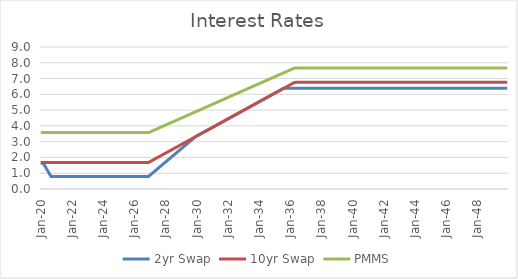
| Category | 2yr Swap | 10yr Swap | PMMS |
|---|---|---|---|
| 2020-01-31 | 1.63 | 1.681 | 3.575 |
| 2020-02-29 | 1.63 | 1.681 | 3.575 |
| 2020-03-31 | 1.63 | 1.681 | 3.575 |
| 2020-04-30 | 1.49 | 1.681 | 3.575 |
| 2020-05-31 | 1.351 | 1.681 | 3.574 |
| 2020-06-30 | 1.212 | 1.681 | 3.574 |
| 2020-07-31 | 1.072 | 1.681 | 3.574 |
| 2020-08-31 | 0.933 | 1.681 | 3.574 |
| 2020-09-30 | 0.798 | 1.681 | 3.574 |
| 2020-10-31 | 0.798 | 1.681 | 3.574 |
| 2020-11-30 | 0.798 | 1.681 | 3.574 |
| 2020-12-31 | 0.798 | 1.681 | 3.574 |
| 2021-01-31 | 0.798 | 1.681 | 3.574 |
| 2021-02-28 | 0.798 | 1.681 | 3.574 |
| 2021-03-31 | 0.798 | 1.681 | 3.574 |
| 2021-04-30 | 0.798 | 1.681 | 3.574 |
| 2021-05-31 | 0.798 | 1.681 | 3.574 |
| 2021-06-30 | 0.798 | 1.681 | 3.574 |
| 2021-07-31 | 0.798 | 1.681 | 3.574 |
| 2021-08-31 | 0.798 | 1.681 | 3.574 |
| 2021-09-30 | 0.798 | 1.681 | 3.574 |
| 2021-10-31 | 0.798 | 1.681 | 3.574 |
| 2021-11-30 | 0.798 | 1.681 | 3.574 |
| 2021-12-31 | 0.798 | 1.681 | 3.574 |
| 2022-01-31 | 0.798 | 1.681 | 3.574 |
| 2022-02-28 | 0.798 | 1.681 | 3.574 |
| 2022-03-31 | 0.798 | 1.681 | 3.574 |
| 2022-04-30 | 0.798 | 1.681 | 3.574 |
| 2022-05-31 | 0.798 | 1.681 | 3.574 |
| 2022-06-30 | 0.798 | 1.681 | 3.574 |
| 2022-07-31 | 0.798 | 1.681 | 3.574 |
| 2022-08-31 | 0.798 | 1.681 | 3.574 |
| 2022-09-30 | 0.798 | 1.681 | 3.574 |
| 2022-10-31 | 0.798 | 1.681 | 3.574 |
| 2022-11-30 | 0.798 | 1.681 | 3.574 |
| 2022-12-31 | 0.798 | 1.681 | 3.574 |
| 2023-01-31 | 0.798 | 1.681 | 3.574 |
| 2023-02-28 | 0.798 | 1.681 | 3.574 |
| 2023-03-31 | 0.798 | 1.681 | 3.574 |
| 2023-04-30 | 0.798 | 1.681 | 3.574 |
| 2023-05-31 | 0.798 | 1.681 | 3.574 |
| 2023-06-30 | 0.798 | 1.681 | 3.574 |
| 2023-07-31 | 0.798 | 1.681 | 3.574 |
| 2023-08-31 | 0.798 | 1.681 | 3.574 |
| 2023-09-30 | 0.798 | 1.681 | 3.574 |
| 2023-10-31 | 0.798 | 1.681 | 3.574 |
| 2023-11-30 | 0.798 | 1.681 | 3.574 |
| 2023-12-31 | 0.798 | 1.681 | 3.574 |
| 2024-01-31 | 0.798 | 1.681 | 3.574 |
| 2024-02-29 | 0.798 | 1.681 | 3.574 |
| 2024-03-31 | 0.798 | 1.681 | 3.574 |
| 2024-04-30 | 0.798 | 1.681 | 3.574 |
| 2024-05-31 | 0.798 | 1.681 | 3.574 |
| 2024-06-30 | 0.798 | 1.681 | 3.574 |
| 2024-07-31 | 0.798 | 1.681 | 3.574 |
| 2024-08-31 | 0.798 | 1.681 | 3.574 |
| 2024-09-30 | 0.798 | 1.681 | 3.574 |
| 2024-10-31 | 0.798 | 1.681 | 3.574 |
| 2024-11-30 | 0.798 | 1.681 | 3.574 |
| 2024-12-31 | 0.798 | 1.681 | 3.574 |
| 2025-01-31 | 0.798 | 1.681 | 3.574 |
| 2025-02-28 | 0.798 | 1.681 | 3.574 |
| 2025-03-31 | 0.798 | 1.681 | 3.574 |
| 2025-04-30 | 0.798 | 1.681 | 3.574 |
| 2025-05-31 | 0.798 | 1.681 | 3.574 |
| 2025-06-30 | 0.798 | 1.681 | 3.574 |
| 2025-07-31 | 0.798 | 1.681 | 3.574 |
| 2025-08-31 | 0.798 | 1.681 | 3.574 |
| 2025-09-30 | 0.798 | 1.681 | 3.574 |
| 2025-10-31 | 0.798 | 1.681 | 3.574 |
| 2025-11-30 | 0.798 | 1.681 | 3.574 |
| 2025-12-31 | 0.798 | 1.681 | 3.574 |
| 2026-01-31 | 0.798 | 1.681 | 3.574 |
| 2026-02-28 | 0.798 | 1.681 | 3.574 |
| 2026-03-31 | 0.798 | 1.681 | 3.574 |
| 2026-04-30 | 0.798 | 1.681 | 3.574 |
| 2026-05-31 | 0.798 | 1.681 | 3.574 |
| 2026-06-30 | 0.798 | 1.681 | 3.574 |
| 2026-07-31 | 0.798 | 1.681 | 3.574 |
| 2026-08-31 | 0.798 | 1.681 | 3.574 |
| 2026-09-30 | 0.798 | 1.681 | 3.574 |
| 2026-10-31 | 0.798 | 1.681 | 3.574 |
| 2026-11-30 | 0.798 | 1.681 | 3.574 |
| 2026-12-31 | 0.798 | 1.681 | 3.574 |
| 2027-01-31 | 0.868 | 1.726 | 3.611 |
| 2027-02-28 | 0.938 | 1.772 | 3.647 |
| 2027-03-31 | 1.007 | 1.817 | 3.683 |
| 2027-04-30 | 1.077 | 1.862 | 3.72 |
| 2027-05-31 | 1.147 | 1.907 | 3.756 |
| 2027-06-30 | 1.216 | 1.953 | 3.793 |
| 2027-07-31 | 1.286 | 1.998 | 3.829 |
| 2027-08-31 | 1.356 | 2.043 | 3.866 |
| 2027-09-30 | 1.425 | 2.088 | 3.902 |
| 2027-10-31 | 1.495 | 2.133 | 3.939 |
| 2027-11-30 | 1.565 | 2.179 | 3.975 |
| 2027-12-31 | 1.634 | 2.224 | 4.012 |
| 2028-01-31 | 1.704 | 2.269 | 4.048 |
| 2028-02-29 | 1.774 | 2.314 | 4.085 |
| 2028-03-31 | 1.843 | 2.36 | 4.121 |
| 2028-04-30 | 1.913 | 2.405 | 4.158 |
| 2028-05-31 | 1.983 | 2.45 | 4.194 |
| 2028-06-30 | 2.052 | 2.495 | 4.231 |
| 2028-07-31 | 2.122 | 2.54 | 4.267 |
| 2028-08-31 | 2.192 | 2.586 | 4.304 |
| 2028-09-30 | 2.261 | 2.631 | 4.34 |
| 2028-10-31 | 2.331 | 2.676 | 4.377 |
| 2028-11-30 | 2.401 | 2.721 | 4.413 |
| 2028-12-31 | 2.47 | 2.767 | 4.45 |
| 2029-01-31 | 2.54 | 2.812 | 4.486 |
| 2029-02-28 | 2.61 | 2.857 | 4.523 |
| 2029-03-31 | 2.679 | 2.902 | 4.559 |
| 2029-04-30 | 2.749 | 2.947 | 4.595 |
| 2029-05-31 | 2.819 | 2.993 | 4.632 |
| 2029-06-30 | 2.888 | 3.038 | 4.668 |
| 2029-07-31 | 2.958 | 3.083 | 4.705 |
| 2029-08-31 | 3.028 | 3.128 | 4.741 |
| 2029-09-30 | 3.097 | 3.173 | 4.778 |
| 2029-10-31 | 3.167 | 3.219 | 4.814 |
| 2029-11-30 | 3.237 | 3.264 | 4.851 |
| 2029-12-31 | 3.306 | 3.309 | 4.887 |
| 2030-01-31 | 3.354 | 3.354 | 4.924 |
| 2030-02-28 | 3.4 | 3.4 | 4.96 |
| 2030-03-31 | 3.445 | 3.445 | 4.997 |
| 2030-04-30 | 3.49 | 3.49 | 5.033 |
| 2030-05-31 | 3.535 | 3.535 | 5.07 |
| 2030-06-30 | 3.58 | 3.58 | 5.106 |
| 2030-07-31 | 3.626 | 3.626 | 5.143 |
| 2030-08-31 | 3.671 | 3.671 | 5.179 |
| 2030-09-30 | 3.716 | 3.716 | 5.215 |
| 2030-10-31 | 3.761 | 3.761 | 5.252 |
| 2030-11-30 | 3.807 | 3.807 | 5.288 |
| 2030-12-31 | 3.852 | 3.852 | 5.325 |
| 2031-01-31 | 3.897 | 3.897 | 5.361 |
| 2031-02-28 | 3.942 | 3.942 | 5.398 |
| 2031-03-31 | 3.987 | 3.987 | 5.434 |
| 2031-04-30 | 4.033 | 4.033 | 5.471 |
| 2031-05-31 | 4.078 | 4.078 | 5.507 |
| 2031-06-30 | 4.123 | 4.123 | 5.544 |
| 2031-07-31 | 4.168 | 4.168 | 5.58 |
| 2031-08-31 | 4.214 | 4.214 | 5.617 |
| 2031-09-30 | 4.259 | 4.259 | 5.653 |
| 2031-10-31 | 4.304 | 4.304 | 5.689 |
| 2031-11-30 | 4.349 | 4.349 | 5.726 |
| 2031-12-31 | 4.394 | 4.394 | 5.762 |
| 2032-01-31 | 4.44 | 4.44 | 5.799 |
| 2032-02-29 | 4.485 | 4.485 | 5.835 |
| 2032-03-31 | 4.53 | 4.53 | 5.872 |
| 2032-04-30 | 4.575 | 4.575 | 5.908 |
| 2032-05-31 | 4.621 | 4.621 | 5.945 |
| 2032-06-30 | 4.666 | 4.666 | 5.981 |
| 2032-07-31 | 4.711 | 4.711 | 6.018 |
| 2032-08-31 | 4.756 | 4.756 | 6.054 |
| 2032-09-30 | 4.801 | 4.801 | 6.091 |
| 2032-10-31 | 4.847 | 4.847 | 6.127 |
| 2032-11-30 | 4.892 | 4.892 | 6.163 |
| 2032-12-31 | 4.937 | 4.937 | 6.2 |
| 2033-01-31 | 4.982 | 4.982 | 6.236 |
| 2033-02-28 | 5.028 | 5.028 | 6.273 |
| 2033-03-31 | 5.073 | 5.073 | 6.309 |
| 2033-04-30 | 5.118 | 5.118 | 6.346 |
| 2033-05-31 | 5.163 | 5.163 | 6.382 |
| 2033-06-30 | 5.208 | 5.208 | 6.419 |
| 2033-07-31 | 5.254 | 5.254 | 6.455 |
| 2033-08-31 | 5.299 | 5.299 | 6.492 |
| 2033-09-30 | 5.344 | 5.344 | 6.528 |
| 2033-10-31 | 5.389 | 5.389 | 6.565 |
| 2033-11-30 | 5.435 | 5.435 | 6.601 |
| 2033-12-31 | 5.48 | 5.48 | 6.637 |
| 2034-01-31 | 5.525 | 5.525 | 6.674 |
| 2034-02-28 | 5.57 | 5.57 | 6.71 |
| 2034-03-31 | 5.615 | 5.615 | 6.747 |
| 2034-04-30 | 5.661 | 5.661 | 6.783 |
| 2034-05-31 | 5.706 | 5.706 | 6.82 |
| 2034-06-30 | 5.751 | 5.751 | 6.856 |
| 2034-07-31 | 5.796 | 5.796 | 6.893 |
| 2034-08-31 | 5.842 | 5.842 | 6.929 |
| 2034-09-30 | 5.887 | 5.887 | 6.966 |
| 2034-10-31 | 5.932 | 5.932 | 7.002 |
| 2034-11-30 | 5.977 | 5.977 | 7.039 |
| 2034-12-31 | 6.022 | 6.022 | 7.075 |
| 2035-01-31 | 6.068 | 6.068 | 7.111 |
| 2035-02-28 | 6.113 | 6.113 | 7.148 |
| 2035-03-31 | 6.158 | 6.158 | 7.184 |
| 2035-04-30 | 6.203 | 6.203 | 7.221 |
| 2035-05-31 | 6.248 | 6.248 | 7.257 |
| 2035-06-30 | 6.294 | 6.294 | 7.294 |
| 2035-07-31 | 6.339 | 6.339 | 7.33 |
| 2035-08-31 | 6.384 | 6.384 | 7.367 |
| 2035-09-30 | 6.387 | 6.429 | 7.403 |
| 2035-10-31 | 6.387 | 6.475 | 7.44 |
| 2035-11-30 | 6.387 | 6.52 | 7.476 |
| 2035-12-31 | 6.387 | 6.565 | 7.512 |
| 2036-01-31 | 6.387 | 6.61 | 7.549 |
| 2036-02-29 | 6.387 | 6.655 | 7.585 |
| 2036-03-31 | 6.387 | 6.701 | 7.622 |
| 2036-04-30 | 6.387 | 6.746 | 7.658 |
| 2036-05-31 | 6.387 | 6.758 | 7.668 |
| 2036-06-30 | 6.387 | 6.758 | 7.668 |
| 2036-07-31 | 6.387 | 6.758 | 7.668 |
| 2036-08-31 | 6.387 | 6.758 | 7.668 |
| 2036-09-30 | 6.387 | 6.758 | 7.668 |
| 2036-10-31 | 6.387 | 6.758 | 7.668 |
| 2036-11-30 | 6.387 | 6.758 | 7.668 |
| 2036-12-31 | 6.387 | 6.758 | 7.668 |
| 2037-01-31 | 6.387 | 6.758 | 7.668 |
| 2037-02-28 | 6.387 | 6.758 | 7.668 |
| 2037-03-31 | 6.387 | 6.758 | 7.668 |
| 2037-04-30 | 6.387 | 6.758 | 7.668 |
| 2037-05-31 | 6.387 | 6.758 | 7.668 |
| 2037-06-30 | 6.387 | 6.758 | 7.668 |
| 2037-07-31 | 6.387 | 6.758 | 7.668 |
| 2037-08-31 | 6.387 | 6.758 | 7.668 |
| 2037-09-30 | 6.387 | 6.758 | 7.668 |
| 2037-10-31 | 6.387 | 6.758 | 7.668 |
| 2037-11-30 | 6.387 | 6.758 | 7.668 |
| 2037-12-31 | 6.387 | 6.758 | 7.668 |
| 2038-01-31 | 6.387 | 6.758 | 7.668 |
| 2038-02-28 | 6.387 | 6.758 | 7.668 |
| 2038-03-31 | 6.387 | 6.758 | 7.668 |
| 2038-04-30 | 6.387 | 6.758 | 7.668 |
| 2038-05-31 | 6.387 | 6.758 | 7.668 |
| 2038-06-30 | 6.387 | 6.758 | 7.668 |
| 2038-07-31 | 6.387 | 6.758 | 7.668 |
| 2038-08-31 | 6.387 | 6.758 | 7.668 |
| 2038-09-30 | 6.387 | 6.758 | 7.668 |
| 2038-10-31 | 6.387 | 6.758 | 7.668 |
| 2038-11-30 | 6.387 | 6.758 | 7.668 |
| 2038-12-31 | 6.387 | 6.758 | 7.668 |
| 2039-01-31 | 6.387 | 6.758 | 7.668 |
| 2039-02-28 | 6.387 | 6.758 | 7.668 |
| 2039-03-31 | 6.387 | 6.758 | 7.668 |
| 2039-04-30 | 6.387 | 6.758 | 7.668 |
| 2039-05-31 | 6.387 | 6.758 | 7.668 |
| 2039-06-30 | 6.387 | 6.758 | 7.668 |
| 2039-07-31 | 6.387 | 6.758 | 7.668 |
| 2039-08-31 | 6.387 | 6.758 | 7.668 |
| 2039-09-30 | 6.387 | 6.758 | 7.668 |
| 2039-10-31 | 6.387 | 6.758 | 7.668 |
| 2039-11-30 | 6.387 | 6.758 | 7.668 |
| 2039-12-31 | 6.387 | 6.758 | 7.668 |
| 2040-01-31 | 6.387 | 6.758 | 7.668 |
| 2040-02-29 | 6.387 | 6.758 | 7.668 |
| 2040-03-31 | 6.387 | 6.758 | 7.668 |
| 2040-04-30 | 6.387 | 6.758 | 7.668 |
| 2040-05-31 | 6.387 | 6.758 | 7.668 |
| 2040-06-30 | 6.387 | 6.758 | 7.668 |
| 2040-07-31 | 6.387 | 6.758 | 7.668 |
| 2040-08-31 | 6.387 | 6.758 | 7.668 |
| 2040-09-30 | 6.387 | 6.758 | 7.668 |
| 2040-10-31 | 6.387 | 6.758 | 7.668 |
| 2040-11-30 | 6.387 | 6.758 | 7.668 |
| 2040-12-31 | 6.387 | 6.758 | 7.668 |
| 2041-01-31 | 6.387 | 6.758 | 7.668 |
| 2041-02-28 | 6.387 | 6.758 | 7.668 |
| 2041-03-31 | 6.387 | 6.758 | 7.668 |
| 2041-04-30 | 6.387 | 6.758 | 7.668 |
| 2041-05-31 | 6.387 | 6.758 | 7.668 |
| 2041-06-30 | 6.387 | 6.758 | 7.668 |
| 2041-07-31 | 6.387 | 6.758 | 7.668 |
| 2041-08-31 | 6.387 | 6.758 | 7.668 |
| 2041-09-30 | 6.387 | 6.758 | 7.668 |
| 2041-10-31 | 6.387 | 6.758 | 7.668 |
| 2041-11-30 | 6.387 | 6.758 | 7.668 |
| 2041-12-31 | 6.387 | 6.758 | 7.668 |
| 2042-01-31 | 6.387 | 6.758 | 7.668 |
| 2042-02-28 | 6.387 | 6.758 | 7.668 |
| 2042-03-31 | 6.387 | 6.758 | 7.668 |
| 2042-04-30 | 6.387 | 6.758 | 7.668 |
| 2042-05-31 | 6.387 | 6.758 | 7.668 |
| 2042-06-30 | 6.387 | 6.758 | 7.668 |
| 2042-07-31 | 6.387 | 6.758 | 7.668 |
| 2042-08-31 | 6.387 | 6.758 | 7.668 |
| 2042-09-30 | 6.387 | 6.758 | 7.668 |
| 2042-10-31 | 6.387 | 6.758 | 7.668 |
| 2042-11-30 | 6.387 | 6.758 | 7.668 |
| 2042-12-31 | 6.387 | 6.758 | 7.668 |
| 2043-01-31 | 6.387 | 6.758 | 7.668 |
| 2043-02-28 | 6.387 | 6.758 | 7.668 |
| 2043-03-31 | 6.387 | 6.758 | 7.668 |
| 2043-04-30 | 6.387 | 6.758 | 7.668 |
| 2043-05-31 | 6.387 | 6.758 | 7.668 |
| 2043-06-30 | 6.387 | 6.758 | 7.668 |
| 2043-07-31 | 6.387 | 6.758 | 7.668 |
| 2043-08-31 | 6.387 | 6.758 | 7.668 |
| 2043-09-30 | 6.387 | 6.758 | 7.668 |
| 2043-10-31 | 6.387 | 6.758 | 7.668 |
| 2043-11-30 | 6.387 | 6.758 | 7.668 |
| 2043-12-31 | 6.387 | 6.758 | 7.668 |
| 2044-01-31 | 6.387 | 6.758 | 7.668 |
| 2044-02-29 | 6.387 | 6.758 | 7.668 |
| 2044-03-31 | 6.387 | 6.758 | 7.668 |
| 2044-04-30 | 6.387 | 6.758 | 7.668 |
| 2044-05-31 | 6.387 | 6.758 | 7.668 |
| 2044-06-30 | 6.387 | 6.758 | 7.668 |
| 2044-07-31 | 6.387 | 6.758 | 7.668 |
| 2044-08-31 | 6.387 | 6.758 | 7.668 |
| 2044-09-30 | 6.387 | 6.758 | 7.668 |
| 2044-10-31 | 6.387 | 6.758 | 7.668 |
| 2044-11-30 | 6.387 | 6.758 | 7.668 |
| 2044-12-31 | 6.387 | 6.758 | 7.668 |
| 2045-01-31 | 6.387 | 6.758 | 7.668 |
| 2045-02-28 | 6.387 | 6.758 | 7.668 |
| 2045-03-31 | 6.387 | 6.758 | 7.668 |
| 2045-04-30 | 6.387 | 6.758 | 7.668 |
| 2045-05-31 | 6.387 | 6.758 | 7.668 |
| 2045-06-30 | 6.387 | 6.758 | 7.668 |
| 2045-07-31 | 6.387 | 6.758 | 7.668 |
| 2045-08-31 | 6.387 | 6.758 | 7.668 |
| 2045-09-30 | 6.387 | 6.758 | 7.668 |
| 2045-10-31 | 6.387 | 6.758 | 7.668 |
| 2045-11-30 | 6.387 | 6.758 | 7.668 |
| 2045-12-31 | 6.387 | 6.758 | 7.668 |
| 2046-01-31 | 6.387 | 6.758 | 7.668 |
| 2046-02-28 | 6.387 | 6.758 | 7.668 |
| 2046-03-31 | 6.387 | 6.758 | 7.668 |
| 2046-04-30 | 6.387 | 6.758 | 7.668 |
| 2046-05-31 | 6.387 | 6.758 | 7.668 |
| 2046-06-30 | 6.387 | 6.758 | 7.668 |
| 2046-07-31 | 6.387 | 6.758 | 7.668 |
| 2046-08-31 | 6.387 | 6.758 | 7.668 |
| 2046-09-30 | 6.387 | 6.758 | 7.668 |
| 2046-10-31 | 6.387 | 6.758 | 7.668 |
| 2046-11-30 | 6.387 | 6.758 | 7.668 |
| 2046-12-31 | 6.387 | 6.758 | 7.668 |
| 2047-01-31 | 6.387 | 6.758 | 7.668 |
| 2047-02-28 | 6.387 | 6.758 | 7.668 |
| 2047-03-31 | 6.387 | 6.758 | 7.668 |
| 2047-04-30 | 6.387 | 6.758 | 7.668 |
| 2047-05-31 | 6.387 | 6.758 | 7.668 |
| 2047-06-30 | 6.387 | 6.758 | 7.668 |
| 2047-07-31 | 6.387 | 6.758 | 7.668 |
| 2047-08-31 | 6.387 | 6.758 | 7.668 |
| 2047-09-30 | 6.387 | 6.758 | 7.668 |
| 2047-10-31 | 6.387 | 6.758 | 7.668 |
| 2047-11-30 | 6.387 | 6.758 | 7.668 |
| 2047-12-31 | 6.387 | 6.758 | 7.668 |
| 2048-01-31 | 6.387 | 6.758 | 7.668 |
| 2048-02-29 | 6.387 | 6.758 | 7.668 |
| 2048-03-31 | 6.387 | 6.758 | 7.668 |
| 2048-04-30 | 6.387 | 6.758 | 7.668 |
| 2048-05-31 | 6.387 | 6.758 | 7.668 |
| 2048-06-30 | 6.387 | 6.758 | 7.668 |
| 2048-07-31 | 6.387 | 6.758 | 7.668 |
| 2048-08-31 | 6.387 | 6.758 | 7.668 |
| 2048-09-30 | 6.387 | 6.758 | 7.668 |
| 2048-10-31 | 6.387 | 6.758 | 7.668 |
| 2048-11-30 | 6.387 | 6.758 | 7.668 |
| 2048-12-31 | 6.387 | 6.758 | 7.668 |
| 2049-01-31 | 6.387 | 6.758 | 7.668 |
| 2049-02-28 | 6.387 | 6.758 | 7.668 |
| 2049-03-31 | 6.387 | 6.758 | 7.668 |
| 2049-04-30 | 6.387 | 6.758 | 7.668 |
| 2049-05-31 | 6.387 | 6.758 | 7.668 |
| 2049-06-30 | 6.387 | 6.758 | 7.668 |
| 2049-07-31 | 6.387 | 6.758 | 7.668 |
| 2049-08-31 | 6.387 | 6.758 | 7.668 |
| 2049-09-30 | 6.387 | 6.758 | 7.668 |
| 2049-10-31 | 6.387 | 6.758 | 7.668 |
| 2049-11-30 | 6.387 | 6.758 | 7.668 |
| 2049-12-31 | 6.387 | 6.758 | 7.668 |